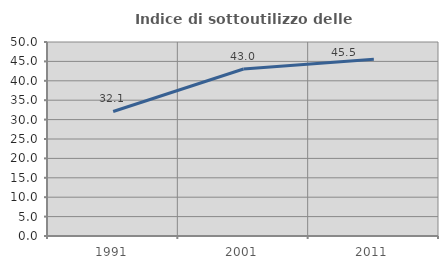
| Category | Indice di sottoutilizzo delle abitazioni  |
|---|---|
| 1991.0 | 32.093 |
| 2001.0 | 43.038 |
| 2011.0 | 45.536 |